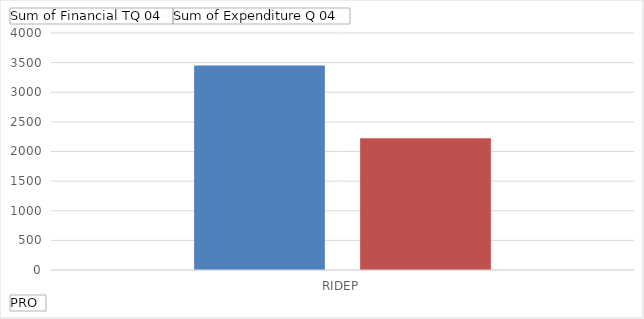
| Category | Sum of Financial TQ 04 | Sum of Expenditure Q 04 |
|---|---|---|
| RIDEP | 3451.53 | 2225.64 |